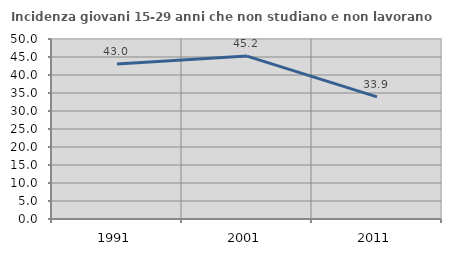
| Category | Incidenza giovani 15-29 anni che non studiano e non lavorano  |
|---|---|
| 1991.0 | 43.049 |
| 2001.0 | 45.247 |
| 2011.0 | 33.906 |